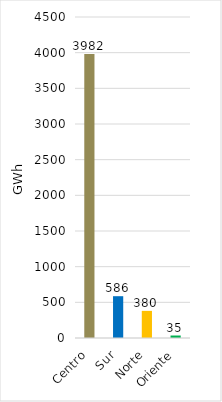
| Category | Series 0 |
|---|---|
| Centro | 3982.32 |
| Sur | 586.034 |
| Norte | 380.314 |
| Oriente | 34.898 |